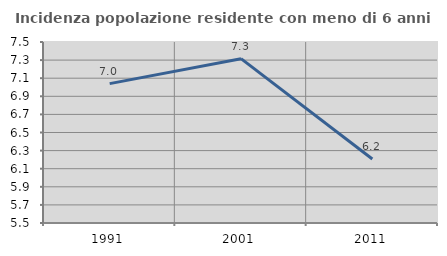
| Category | Incidenza popolazione residente con meno di 6 anni |
|---|---|
| 1991.0 | 7.04 |
| 2001.0 | 7.316 |
| 2011.0 | 6.207 |